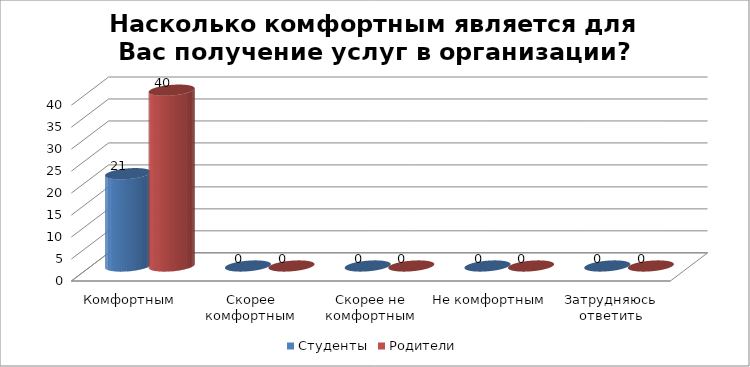
| Category | Студенты | Родители |
|---|---|---|
| Комфортным | 21 | 40 |
| Скорее комфортным | 0 | 0 |
| Скорее не комфортным | 0 | 0 |
| Не комфортным | 0 | 0 |
| Затрудняюсь ответить | 0 | 0 |